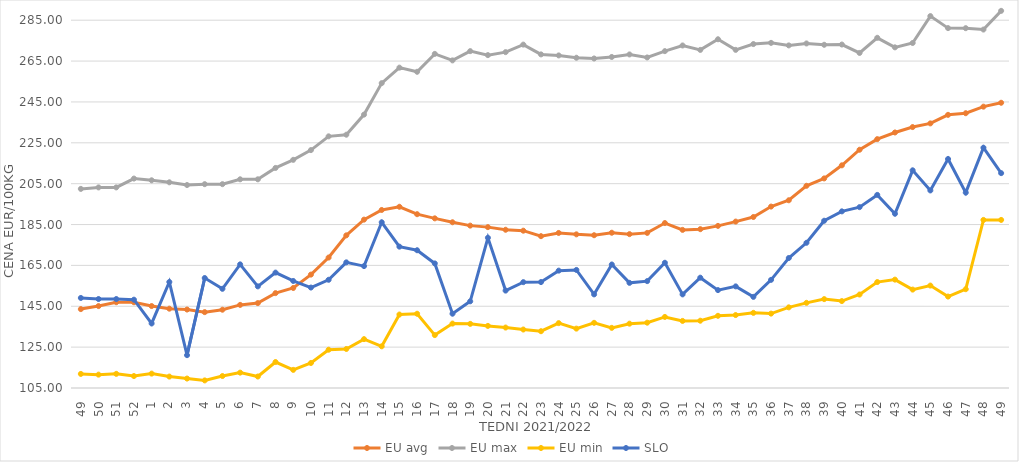
| Category | EU avg | EU max | EU min | SLO |
|---|---|---|---|---|
| 49.0 | 143.614 | 202.45 | 111.89 | 149.07 |
| 50.0 | 145.101 | 203.17 | 111.54 | 148.55 |
| 51.0 | 146.984 | 203.17 | 111.93 | 148.54 |
| 52.0 | 146.958 | 207.5 | 110.85 | 148.22 |
| 1.0 | 145.11 | 206.66 | 112.04 | 136.59 |
| 2.0 | 143.822 | 205.67 | 110.59 | 156.88 |
| 3.0 | 143.402 | 204.34 | 109.62 | 121.07 |
| 4.0 | 142.134 | 204.76 | 108.71 | 158.82 |
| 5.0 | 143.314 | 204.76 | 110.86 | 153.55 |
| 6.0 | 145.677 | 207.14 | 112.52 | 165.51 |
| 7.0 | 146.556 | 207.14 | 110.619 | 154.74 |
| 8.0 | 151.439 | 212.7 | 117.709 | 161.48 |
| 9.0 | 153.947 | 216.67 | 113.871 | 157.38 |
| 10.0 | 160.496 | 221.43 | 117.233 | 154.16 |
| 11.0 | 168.845 | 228.17 | 123.737 | 157.96 |
| 12.0 | 179.714 | 228.97 | 124.105 | 166.49 |
| 13.0 | 187.409 | 238.81 | 128.918 | 164.66 |
| 14.0 | 192.137 | 254.21 | 125.399 | 186.11 |
| 15.0 | 193.697 | 261.79 | 140.954 | 174.18 |
| 16.0 | 190.066 | 259.76 | 141.337 | 172.42 |
| 17.0 | 188.031 | 268.52 | 130.897 | 165.96 |
| 18.0 | 186.119 | 265.34 | 136.529 | 141.36 |
| 19.0 | 184.47 | 269.87 | 136.387 | 147.43 |
| 20.0 | 183.734 | 267.92 | 135.392 | 178.51 |
| 21.0 | 182.45 | 269.38 | 134.589 | 152.67 |
| 22.0 | 181.991 | 273.06 | 133.621 | 156.8 |
| 23.0 | 179.308 | 268.27 | 132.787 | 156.84 |
| 24.0 | 180.886 | 267.77 | 136.75 | 162.44 |
| 25.0 | 180.2 | 266.63 | 134.058 | 162.78 |
| 26.0 | 179.77 | 266.27 | 136.895 | 150.82 |
| 27.0 | 180.992 | 267.02 | 134.44 | 165.45 |
| 28.0 | 180.305 | 268.25 | 136.486 | 156.46 |
| 29.0 | 180.913 | 266.77 | 136.97 | 157.31 |
| 30.0 | 185.728 | 269.87 | 139.777 | 166.29 |
| 31.0 | 182.385 | 272.64 | 137.828 | 150.81 |
| 32.0 | 182.73 | 270.47 | 137.934 | 158.99 |
| 33.0 | 184.343 | 275.68 | 140.33 | 152.91 |
| 34.0 | 186.448 | 270.49 | 140.7 | 154.73 |
| 35.0 | 188.684 | 273.33 | 141.78 | 149.6 |
| 36.0 | 193.792 | 273.91 | 141.41 | 157.93 |
| 37.0 | 196.877 | 272.67 | 144.47 | 168.61 |
| 38.0 | 203.962 | 273.63 | 146.68 | 176.07 |
| 39.0 | 207.574 | 272.98 | 148.499 | 186.86 |
| 40.0 | 213.979 | 273.1 | 147.54 | 191.45 |
| 41.0 | 221.608 | 268.98 | 150.75 | 193.52 |
| 42.0 | 226.807 | 276.39 | 156.848 | 199.51 |
| 43.0 | 230.056 | 271.72 | 158.04 | 190.28 |
| 44.0 | 232.707 | 273.856 | 153.16 | 211.53 |
| 45.0 | 234.505 | 287.021 | 155.13 | 201.69 |
| 46.0 | 238.688 | 281.133 | 149.75 | 217.08 |
| 47.0 | 239.488 | 281.102 | 153.36 | 200.62 |
| 48.0 | 242.694 | 280.434 | 187.26 | 222.61 |
| 49.0 | 244.596 | 289.585 | 187.26 | 210.16 |